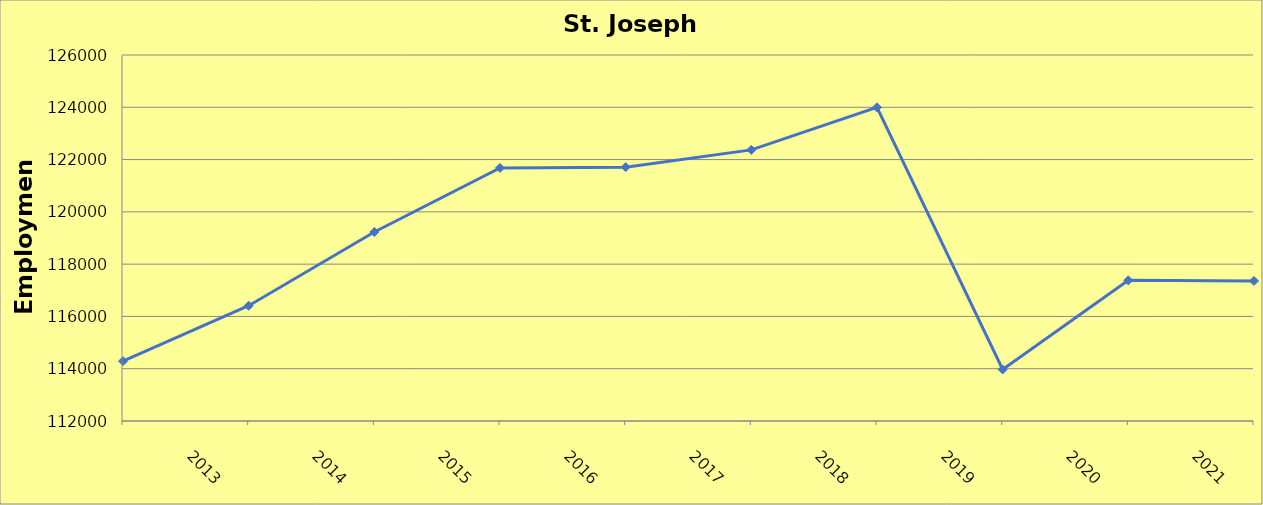
| Category | St Joseph County |
|---|---|
| 2013.0 | 114290 |
| 2014.0 | 116410 |
| 2015.0 | 119230 |
| 2016.0 | 121680 |
| 2017.0 | 121710 |
| 2018.0 | 122370 |
| 2019.0 | 124000 |
| 2020.0 | 113970 |
| 2021.0 | 117380 |
| 2022.0 | 117356 |